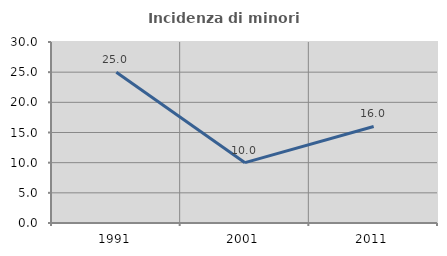
| Category | Incidenza di minori stranieri |
|---|---|
| 1991.0 | 25 |
| 2001.0 | 10 |
| 2011.0 | 16 |